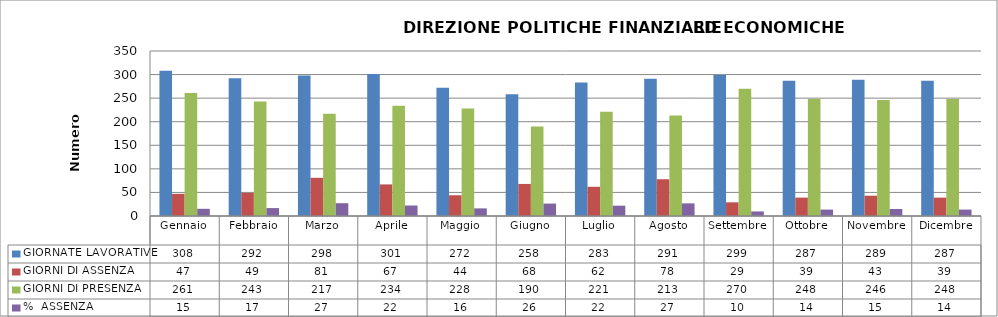
| Category | GIORNATE LAVORATIVE | GIORNI DI ASSENZA | GIORNI DI PRESENZA | %  ASSENZA |
|---|---|---|---|---|
| Gennaio | 308 | 47 | 261 | 15.26 |
| Febbraio | 292 | 49 | 243 | 16.781 |
| Marzo | 298 | 81 | 217 | 27.181 |
| Aprile | 301 | 67 | 234 | 22.259 |
| Maggio | 272 | 44 | 228 | 16.176 |
| Giugno | 258 | 68 | 190 | 26.357 |
| Luglio | 283 | 62 | 221 | 21.908 |
| Agosto | 291 | 78 | 213 | 26.804 |
| Settembre | 299 | 29 | 270 | 9.699 |
| Ottobre | 287 | 39 | 248 | 13.589 |
| Novembre | 289 | 43 | 246 | 14.879 |
| Dicembre | 287 | 39 | 248 | 13.589 |